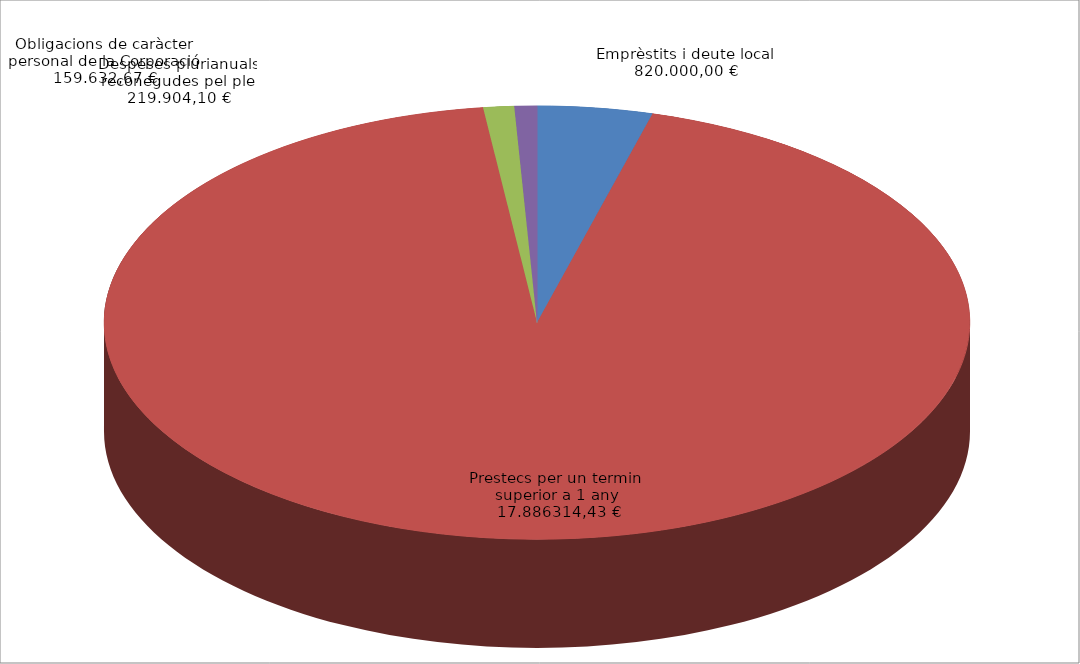
| Category | Series 0 |
|---|---|
| Emprèstits i deute local | 820000 |
| Prestecs per un termini superior a 1 any | 17886314.43 |
| Despeses plurianuals reconegudes pel ple | 219904.1 |
| Obligacions de caràcter personal de la Corporació | 159632.67 |